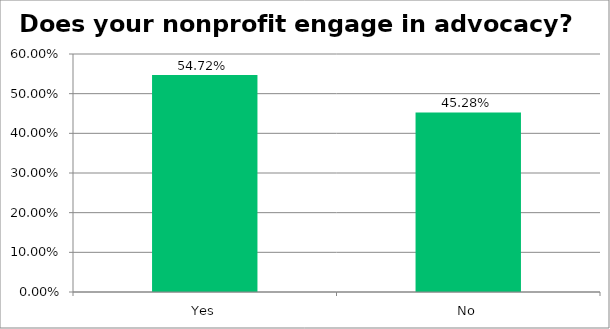
| Category | Responses |
|---|---|
| Yes | 0.547 |
| No | 0.453 |